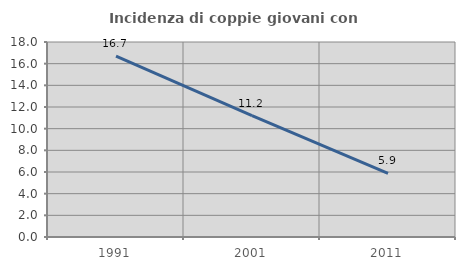
| Category | Incidenza di coppie giovani con figli |
|---|---|
| 1991.0 | 16.706 |
| 2001.0 | 11.196 |
| 2011.0 | 5.863 |